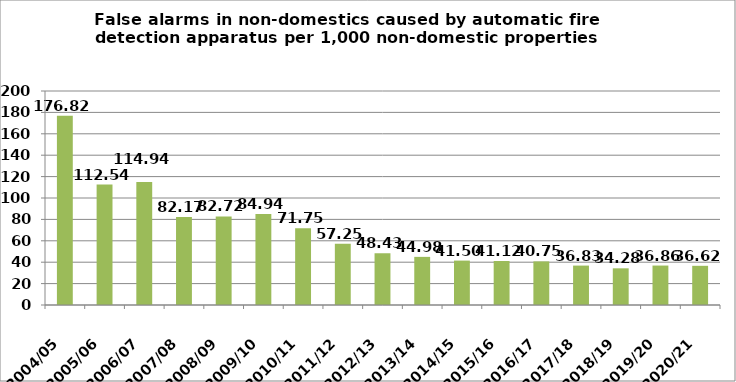
| Category | Series 0 |
|---|---|
| 2004/05 | 176.82 |
| 2005/06 | 112.54 |
| 2006/07 | 114.94 |
| 2007/08 | 82.17 |
| 2008/09 | 82.72 |
| 2009/10 | 84.94 |
| 2010/11 | 71.75 |
| 2011/12 | 57.25 |
| 2012/13 | 48.43 |
| 2013/14 | 44.98 |
| 2014/15 | 41.5 |
| 2015/16 | 41.12 |
| 2016/17 | 40.75 |
| 2017/18 | 36.83 |
| 2018/19 | 34.28 |
| 2019/20 | 36.86 |
| 2020/21 | 36.62 |